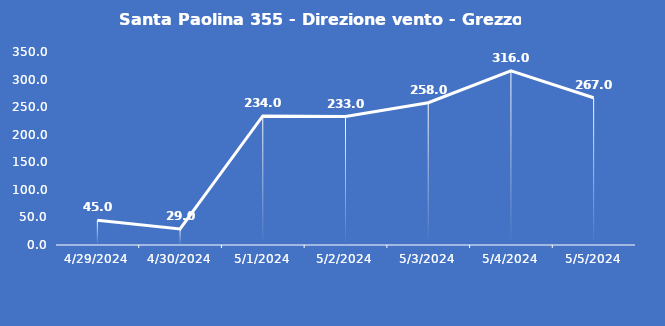
| Category | Santa Paolina 355 - Direzione vento - Grezzo (°N) |
|---|---|
| 4/29/24 | 45 |
| 4/30/24 | 29 |
| 5/1/24 | 234 |
| 5/2/24 | 233 |
| 5/3/24 | 258 |
| 5/4/24 | 316 |
| 5/5/24 | 267 |